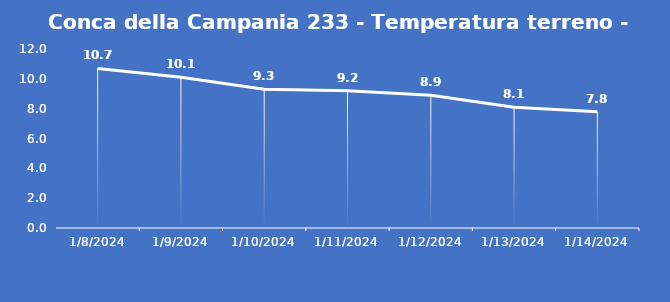
| Category | Conca della Campania 233 - Temperatura terreno - Grezzo (°C) |
|---|---|
| 1/8/24 | 10.7 |
| 1/9/24 | 10.1 |
| 1/10/24 | 9.3 |
| 1/11/24 | 9.2 |
| 1/12/24 | 8.9 |
| 1/13/24 | 8.1 |
| 1/14/24 | 7.8 |